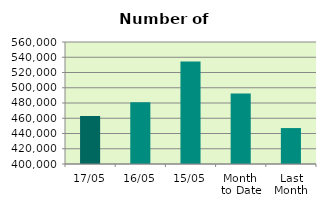
| Category | Series 0 |
|---|---|
| 17/05 | 462894 |
| 16/05 | 481114 |
| 15/05 | 534512 |
| Month 
to Date | 492512.167 |
| Last
Month | 447135.9 |